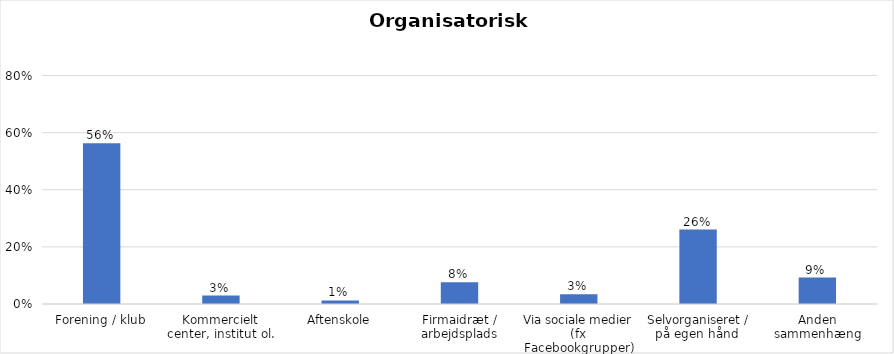
| Category | % |
|---|---|
| Forening / klub | 0.563 |
| Kommercielt center, institut ol. | 0.03 |
| Aftenskole | 0.012 |
| Firmaidræt / arbejdsplads | 0.077 |
| Via sociale medier (fx Facebookgrupper) | 0.035 |
| Selvorganiseret / på egen hånd  | 0.261 |
| Anden sammenhæng | 0.092 |